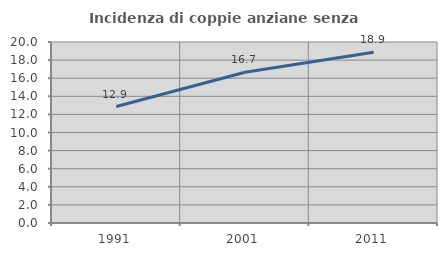
| Category | Incidenza di coppie anziane senza figli  |
|---|---|
| 1991.0 | 12.868 |
| 2001.0 | 16.652 |
| 2011.0 | 18.858 |